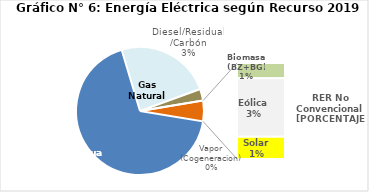
| Category | Series 0 |
|---|---|
| Agua | 3183.595 |
| Gas Natural | 1130.174 |
| Diesel/Residual/Carbón | 138.834 |
| Vapor (Cogeneracion) | 0.31 |
| Biomasa (BZ+BG) | 38.732 |
| Eólica | 149.654 |
| Solar | 57.145 |